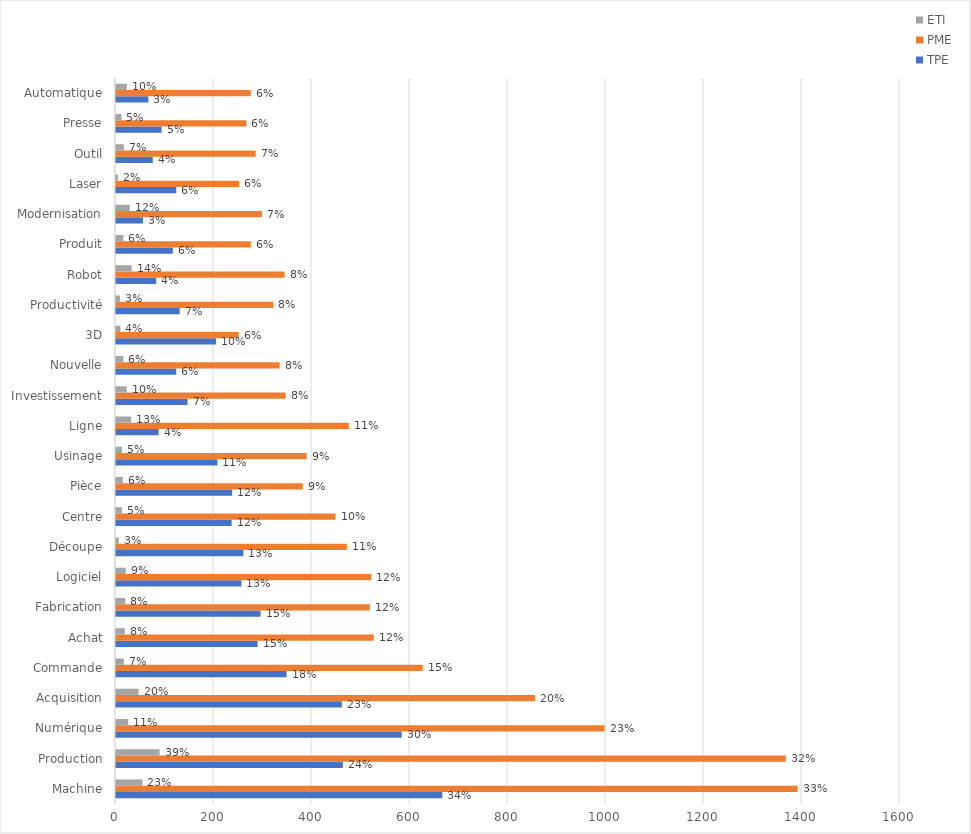
| Category | TPE | PME | ETI |
|---|---|---|---|
| Machine | 666 | 1391 | 54 |
| Production | 463 | 1367 | 89 |
| Numérique | 583 | 997 | 25 |
| Acquisition | 461 | 855 | 46 |
| Commande | 348 | 626 | 16 |
| Achat | 289 | 526 | 18 |
| Fabrication | 295 | 518 | 19 |
| Logiciel | 256 | 521 | 20 |
| Découpe | 260 | 471 | 6 |
| Centre | 236 | 448 | 12 |
| Pièce | 237 | 381 | 14 |
| Usinage | 207 | 389 | 12 |
| Ligne | 87 | 475 | 31 |
| Investissement | 146 | 346 | 22 |
| Nouvelle | 123 | 334 | 15 |
| 3D | 204 | 250 | 9 |
| Productivité | 130 | 321 | 8 |
| Robot | 82 | 344 | 32 |
| Produit | 116 | 275 | 15 |
| Modernisation | 55 | 298 | 28 |
| Laser | 123 | 251 | 4 |
| Outil | 75 | 285 | 16 |
| Presse | 93 | 266 | 11 |
| Automatique | 66 | 275 | 22 |